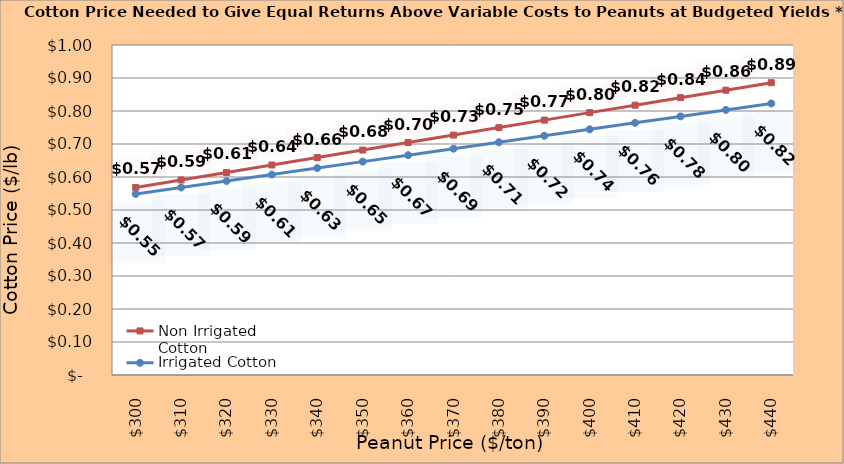
| Category | Non Irrigated Cotton | Irrigated Cotton |
|---|---|---|
| 299.8936170212766 | 0.568 | 0.549 |
| 309.8936170212766 | 0.591 | 0.568 |
| 319.8936170212766 | 0.614 | 0.588 |
| 329.8936170212766 | 0.636 | 0.607 |
| 339.8936170212766 | 0.659 | 0.627 |
| 349.8936170212766 | 0.682 | 0.647 |
| 359.8936170212766 | 0.704 | 0.666 |
| 369.8936170212766 | 0.727 | 0.686 |
| 379.8936170212766 | 0.75 | 0.705 |
| 389.8936170212766 | 0.772 | 0.725 |
| 399.8936170212766 | 0.795 | 0.744 |
| 409.8936170212766 | 0.818 | 0.764 |
| 419.8936170212766 | 0.84 | 0.784 |
| 429.8936170212766 | 0.863 | 0.803 |
| 439.8936170212766 | 0.886 | 0.823 |